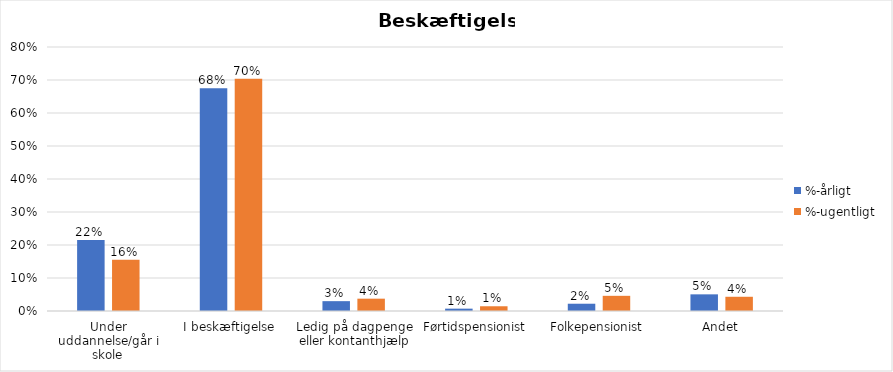
| Category | %-årligt | %-ugentligt |
|---|---|---|
| Under uddannelse/går i skole | 0.215 | 0.155 |
| I beskæftigelse | 0.675 | 0.704 |
| Ledig på dagpenge eller kontanthjælp | 0.03 | 0.037 |
| Førtidspensionist | 0.007 | 0.014 |
| Folkepensionist | 0.022 | 0.046 |
| Andet | 0.05 | 0.043 |